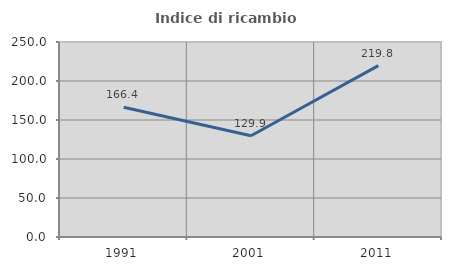
| Category | Indice di ricambio occupazionale  |
|---|---|
| 1991.0 | 166.372 |
| 2001.0 | 129.851 |
| 2011.0 | 219.78 |